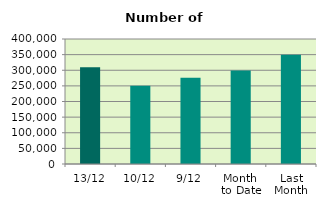
| Category | Series 0 |
|---|---|
| 13/12 | 309286 |
| 10/12 | 250554 |
| 9/12 | 275784 |
| Month 
to Date | 299594.667 |
| Last
Month | 349295 |